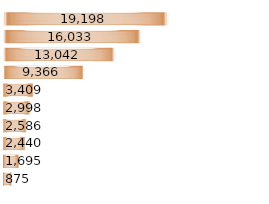
| Category | Series 0 |
|---|---|
|  Australia  | 19198.336 |
|  China  | 16033.175 |
|  New Zealand  | 13042.078 |
|  India  | 9365.594 |
|  Pakistan  | 3409.439 |
|  Hong Kong  | 2997.959 |
|  Vietnam  | 2586.181 |
|  Cambodia  | 2440.399 |
|  Laos  | 1695.387 |
|  Bangladesh  | 874.562 |